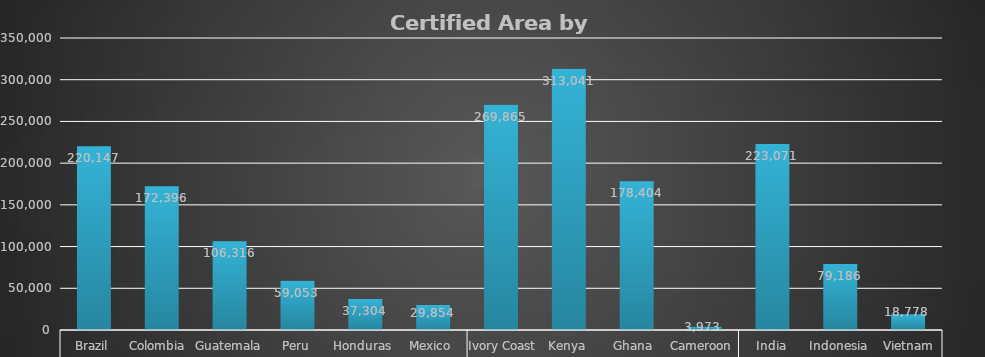
| Category | Jul-21 |
|---|---|
| 0 | 220146.54 |
| 1 | 172396.28 |
| 2 | 106316.14 |
| 3 | 59053.44 |
| 4 | 37304.05 |
| 5 | 29854.37 |
| 6 | 269864.69 |
| 7 | 313040.53 |
| 8 | 178404.31 |
| 9 | 3972.7 |
| 10 | 223070.59 |
| 11 | 79186.09 |
| 12 | 18777.93 |